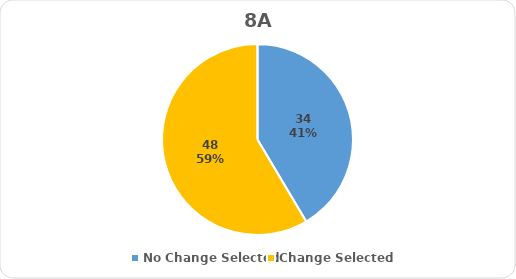
| Category | Series 0 |
|---|---|
| No Change Selected | 34 |
| Change Selected | 48 |